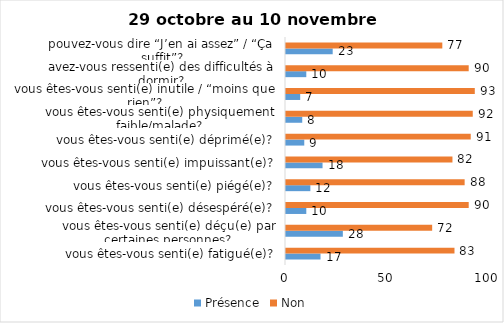
| Category | Présence | Non |
|---|---|---|
| vous êtes-vous senti(e) fatigué(e)? | 17 | 83 |
| vous êtes-vous senti(e) déçu(e) par certaines personnes? | 28 | 72 |
| vous êtes-vous senti(e) désespéré(e)? | 10 | 90 |
| vous êtes-vous senti(e) piégé(e)? | 12 | 88 |
| vous êtes-vous senti(e) impuissant(e)? | 18 | 82 |
| vous êtes-vous senti(e) déprimé(e)? | 9 | 91 |
| vous êtes-vous senti(e) physiquement faible/malade? | 8 | 92 |
| vous êtes-vous senti(e) inutile / “moins que rien”? | 7 | 93 |
| avez-vous ressenti(e) des difficultés à dormir? | 10 | 90 |
| pouvez-vous dire “J’en ai assez” / “Ça suffit”? | 23 | 77 |